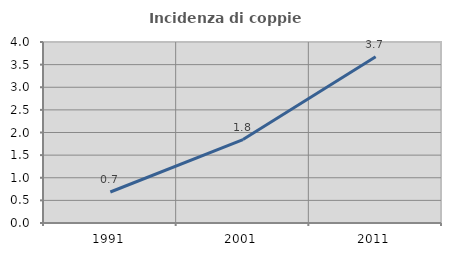
| Category | Incidenza di coppie miste |
|---|---|
| 1991.0 | 0.685 |
| 2001.0 | 1.844 |
| 2011.0 | 3.673 |